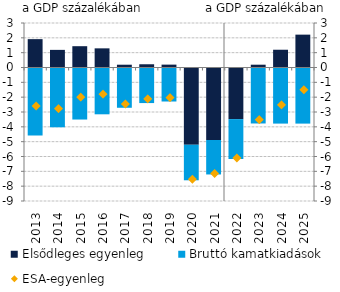
| Category | Elsődleges egyenleg | Bruttó kamatkiadások |
|---|---|---|
| 2013.0 | 1.912 | -4.51 |
| 2014.0 | 1.188 | -3.963 |
| 2015.0 | 1.436 | -3.44 |
| 2016.0 | 1.291 | -3.088 |
| 2017.0 | 0.188 | -2.647 |
| 2018.0 | 0.218 | -2.331 |
| 2019.0 | 0.194 | -2.225 |
| 2020.0 | -5.208 | -2.328 |
| 2021.0 | -4.888 | -2.255 |
| 2022.0 | -3.48 | -2.62 |
| 2023.0 | 0.189 | -3.707 |
| 2024.0 | 1.198 | -3.715 |
| 2025.0 | 2.215 | -3.715 |